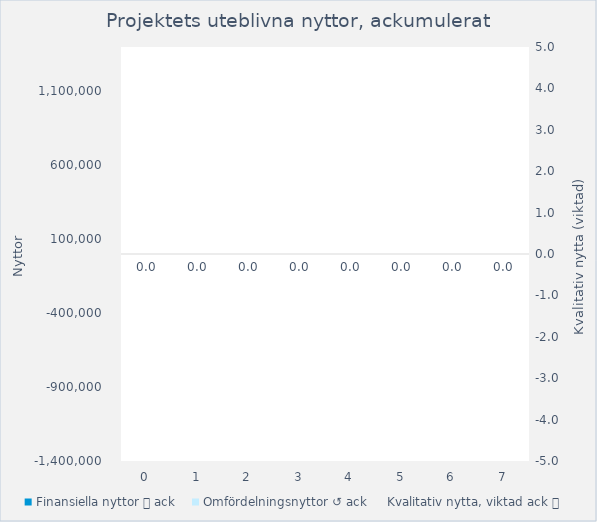
| Category | Finansiella nyttor 💰 ack | Omfördelningsnyttor ↺ ack |
|---|---|---|
| 0.0 | 0 | 0 |
| 1.0 | 0 | 0 |
| 2.0 | 0 | 0 |
| 3.0 | 0 | 0 |
| 4.0 | 0 | 0 |
| 5.0 | 0 | 0 |
| 6.0 | 0 | 0 |
| 7.0 | 0 | 0 |